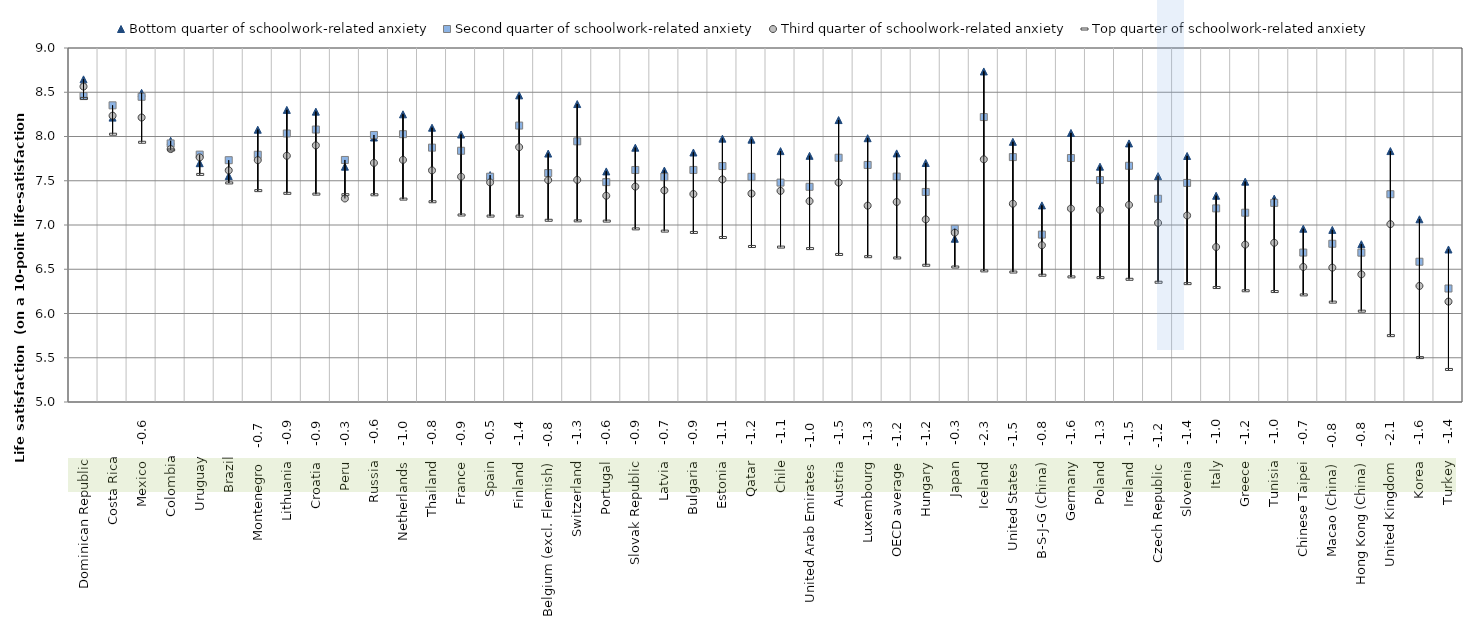
| Category | Bottom quarter of schoolwork-related anxiety | Second quarter of schoolwork-related anxiety | Third quarter of schoolwork-related anxiety | Top quarter of schoolwork-related anxiety |
|---|---|---|---|---|
| Dominican Republic          | 8.646 | 8.457 | 8.564 | 8.431 |
| Costa Rica          | 8.213 | 8.352 | 8.235 | 8.026 |
| Mexico    -0.6 | 8.493 | 8.449 | 8.214 | 7.935 |
| Colombia          | 7.951 | 7.921 | 7.858 | 7.848 |
| Uruguay          | 7.699 | 7.795 | 7.764 | 7.572 |
| Brazil          | 7.552 | 7.732 | 7.617 | 7.475 |
| Montenegro    -0.7 | 8.077 | 7.794 | 7.733 | 7.388 |
| Lithuania    -0.9 | 8.301 | 8.034 | 7.782 | 7.358 |
| Croatia    -0.9 | 8.281 | 8.079 | 7.9 | 7.349 |
| Peru    -0.3 | 7.659 | 7.735 | 7.299 | 7.343 |
| Russia    -0.6 | 7.989 | 8.017 | 7.702 | 7.341 |
| Netherlands    -1.0 | 8.251 | 8.026 | 7.736 | 7.293 |
| Thailand    -0.8 | 8.099 | 7.874 | 7.617 | 7.263 |
| France    -0.9 | 8.023 | 7.839 | 7.546 | 7.113 |
| Spain    -0.5 | 7.564 | 7.546 | 7.481 | 7.101 |
| Finland    -1.4 | 8.465 | 8.123 | 7.879 | 7.1 |
| Belgium (excl. Flemish)    -0.8 | 7.807 | 7.586 | 7.507 | 7.053 |
| Switzerland    -1.3 | 8.367 | 7.945 | 7.51 | 7.047 |
| Portugal    -0.6 | 7.605 | 7.485 | 7.331 | 7.044 |
| Slovak Republic    -0.9 | 7.873 | 7.622 | 7.434 | 6.956 |
| Latvia    -0.7 | 7.615 | 7.542 | 7.391 | 6.931 |
| Bulgaria    -0.9 | 7.819 | 7.622 | 7.35 | 6.916 |
| Estonia    -1.1 | 7.976 | 7.666 | 7.515 | 6.858 |
| Qatar    -1.2 | 7.964 | 7.545 | 7.355 | 6.757 |
| Chile    -1.1 | 7.835 | 7.479 | 7.385 | 6.75 |
| United Arab Emirates    -1.0 | 7.782 | 7.432 | 7.27 | 6.733 |
| Austria    -1.5 | 8.186 | 7.76 | 7.479 | 6.667 |
| Luxembourg    -1.3 | 7.981 | 7.679 | 7.219 | 6.642 |
| OECD average    -1.2 | 7.809 | 7.547 | 7.26 | 6.628 |
| Hungary    -1.2 | 7.701 | 7.373 | 7.063 | 6.545 |
| Japan    -0.3 | 6.845 | 6.957 | 6.913 | 6.525 |
| Iceland    -2.3 | 8.735 | 8.22 | 7.742 | 6.481 |
| United States    -1.5 | 7.94 | 7.767 | 7.24 | 6.468 |
| B-S-J-G (China)    -0.8 | 7.222 | 6.891 | 6.771 | 6.433 |
| Germany    -1.6 | 8.04 | 7.757 | 7.186 | 6.414 |
| Poland    -1.3 | 7.659 | 7.508 | 7.171 | 6.405 |
| Ireland    -1.5 | 7.922 | 7.669 | 7.227 | 6.387 |
| Czech Republic    -1.2 | 7.552 | 7.296 | 7.024 | 6.353 |
| Slovenia    -1.4 | 7.78 | 7.476 | 7.107 | 6.337 |
| Italy    -1.0 | 7.331 | 7.188 | 6.751 | 6.293 |
| Greece    -1.2 | 7.49 | 7.139 | 6.778 | 6.257 |
| Tunisia    -1.0 | 7.298 | 7.25 | 6.799 | 6.248 |
| Chinese Taipei    -0.7 | 6.958 | 6.688 | 6.526 | 6.21 |
| Macao (China)    -0.8 | 6.945 | 6.788 | 6.518 | 6.129 |
| Hong Kong (China)    -0.8 | 6.783 | 6.687 | 6.442 | 6.026 |
| United Kingdom    -2.1 | 7.835 | 7.348 | 7.01 | 5.75 |
| Korea    -1.6 | 7.064 | 6.585 | 6.311 | 5.502 |
| Turkey    -1.4 | 6.723 | 6.282 | 6.134 | 5.368 |